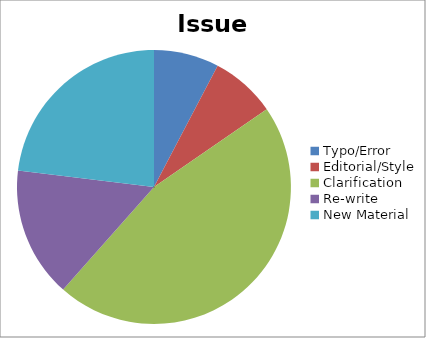
| Category | Issue Type |
|---|---|
| Typo/Error | 1 |
| Editorial/Style | 1 |
| Clarification | 6 |
| Re-write | 2 |
| New Material | 3 |